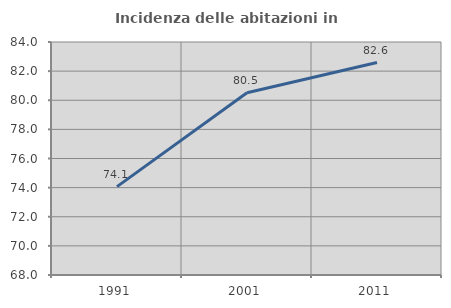
| Category | Incidenza delle abitazioni in proprietà  |
|---|---|
| 1991.0 | 74.069 |
| 2001.0 | 80.512 |
| 2011.0 | 82.59 |